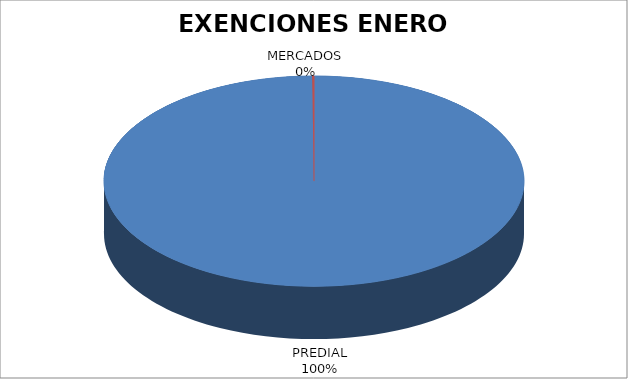
| Category | Series 0 |
|---|---|
| PREDIAL | 4916 |
| MERCADOS | 7 |